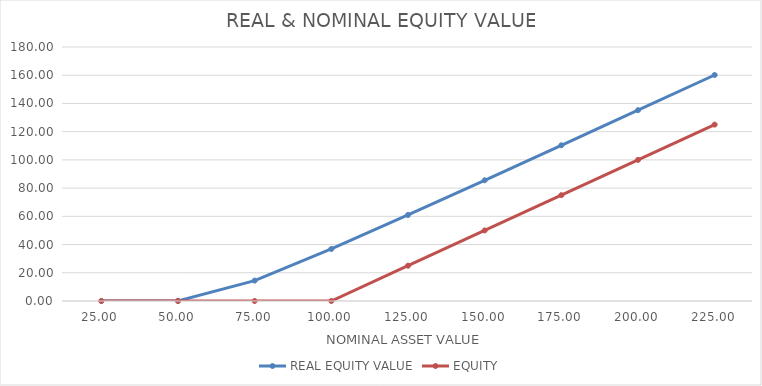
| Category | REAL EQUITY VALUE | EQUITY |
|---|---|---|
| 25.0 | 0 | 0 |
| 50.0 | 0.061 | 0 |
| 75.0 | 14.463 | 0 |
| 100.0 | 36.883 | 0 |
| 125.0 | 60.964 | 25 |
| 150.0 | 85.558 | 50 |
| 175.0 | 110.351 | 75 |
| 200.0 | 135.235 | 100 |
| 225.0 | 160.165 | 125 |